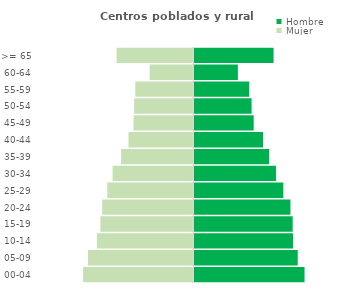
| Category | Hombre | Mujer |
|---|---|---|
| 00-04 | 1474 | -1465 |
| 05-09 | 1383 | -1400 |
| 10-14 | 1322 | -1281 |
| 15-19 | 1316 | -1235 |
| 20-24 | 1286 | -1211 |
| 25-29 | 1191 | -1143 |
| 30-34 | 1093 | -1072 |
| 35-39 | 1003 | -958 |
| 40-44 | 922 | -860 |
| 45-49 | 796 | -793 |
| 50-54 | 768 | -785 |
| 55-59 | 737 | -770 |
| 60-64 | 585 | -578 |
| >= 65 | 1061 | -1019 |